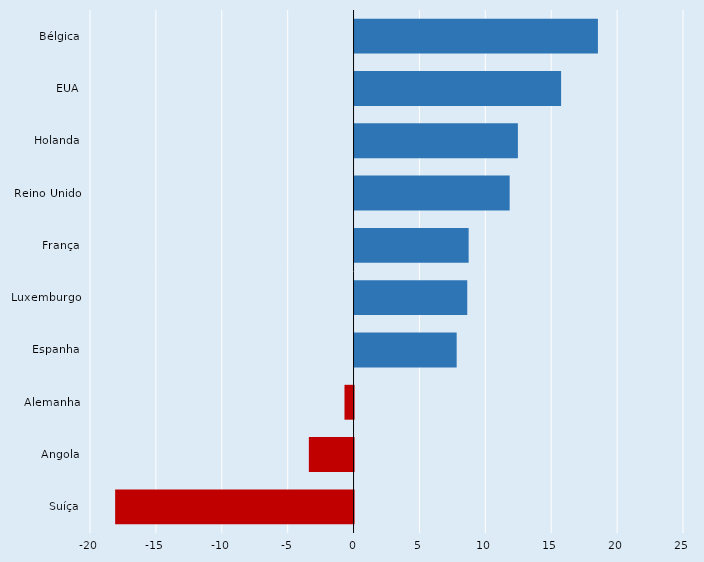
| Category | Series 0 |
|---|---|
| Bélgica | 18.468 |
| EUA | 15.674 |
| Holanda | 12.395 |
| Reino Unido | 11.77 |
| França | 8.658 |
| Luxemburgo | 8.552 |
| Espanha | 7.749 |
| Alemanha | -0.689 |
| Angola | -3.392 |
| Suíça | -18.091 |